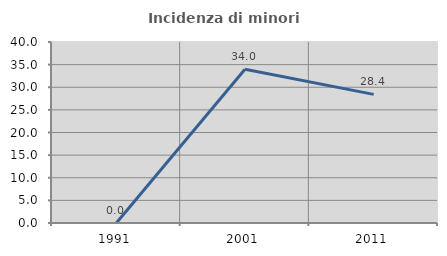
| Category | Incidenza di minori stranieri |
|---|---|
| 1991.0 | 0 |
| 2001.0 | 33.962 |
| 2011.0 | 28.426 |